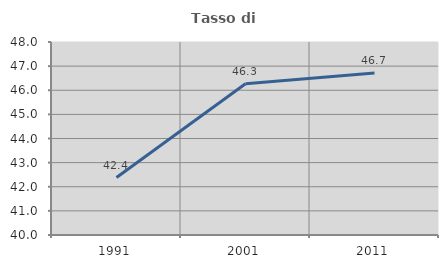
| Category | Tasso di occupazione   |
|---|---|
| 1991.0 | 42.383 |
| 2001.0 | 46.272 |
| 2011.0 | 46.718 |